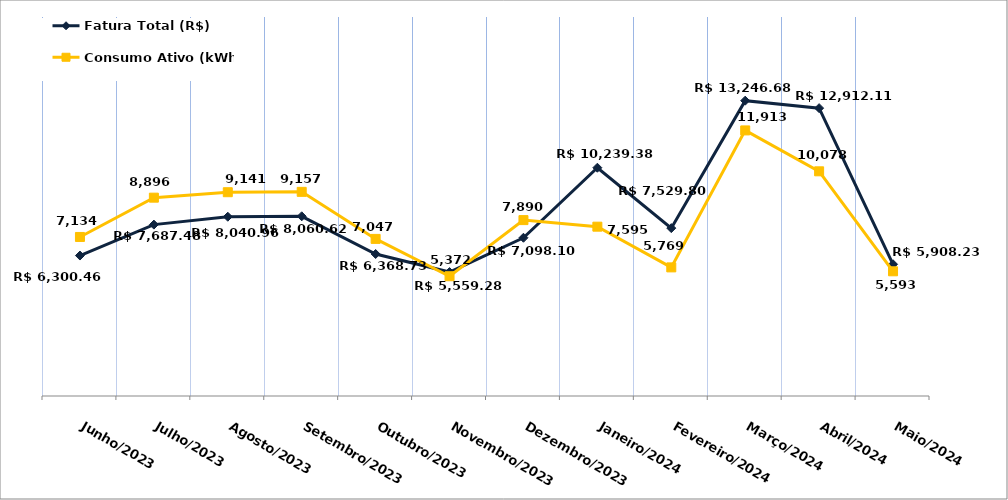
| Category | Fatura Total (R$) |
|---|---|
| Junho/2023 | 6300.46 |
| Julho/2023 | 7687.48 |
| Agosto/2023 | 8040.96 |
| Setembro/2023 | 8060.62 |
| Outubro/2023 | 6368.73 |
| Novembro/2023 | 5559.28 |
| Dezembro/2023 | 7098.1 |
| Janeiro/2024 | 10239.38 |
| Fevereiro/2024 | 7529.8 |
| Março/2024 | 13246.68 |
| Abril/2024 | 12912.11 |
| Maio/2024 | 5908.23 |